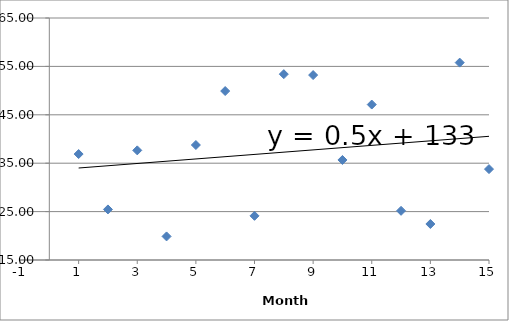
| Category | Series 0 |
|---|---|
| 1.0 | 136.89 |
| 2.0 | 125.45 |
| 3.0 | 137.65 |
| 4.0 | 119.87 |
| 5.0 | 138.76 |
| 6.0 | 149.91 |
| 7.0 | 124.12 |
| 8.0 | 153.4 |
| 9.0 | 153.21 |
| 10.0 | 135.67 |
| 11.0 | 147.12 |
| 12.0 | 125.16 |
| 13.0 | 122.44 |
| 14.0 | 155.78 |
| 15.0 | 133.78 |